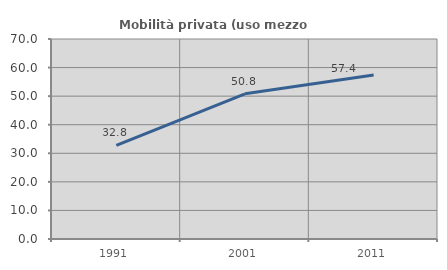
| Category | Mobilità privata (uso mezzo privato) |
|---|---|
| 1991.0 | 32.799 |
| 2001.0 | 50.811 |
| 2011.0 | 57.374 |